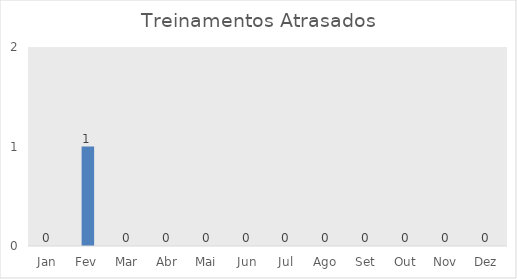
| Category | Treinamentos Atrasados |
|---|---|
| Jan | 0 |
| Fev | 1 |
| Mar | 0 |
| Abr | 0 |
| Mai | 0 |
| Jun | 0 |
| Jul | 0 |
| Ago | 0 |
| Set | 0 |
| Out | 0 |
| Nov | 0 |
| Dez | 0 |